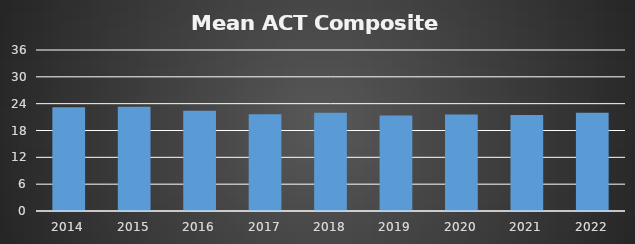
| Category | Average |
|---|---|
| 2014 | 23.188 |
| 2015 | 23.319 |
| 2016 | 22.444 |
| 2017 | 21.644 |
| 2018 | 21.949 |
| 2019 | 21.375 |
| 2020 | 21.593 |
| 2021 | 21.471 |
| 2022 | 21.99 |